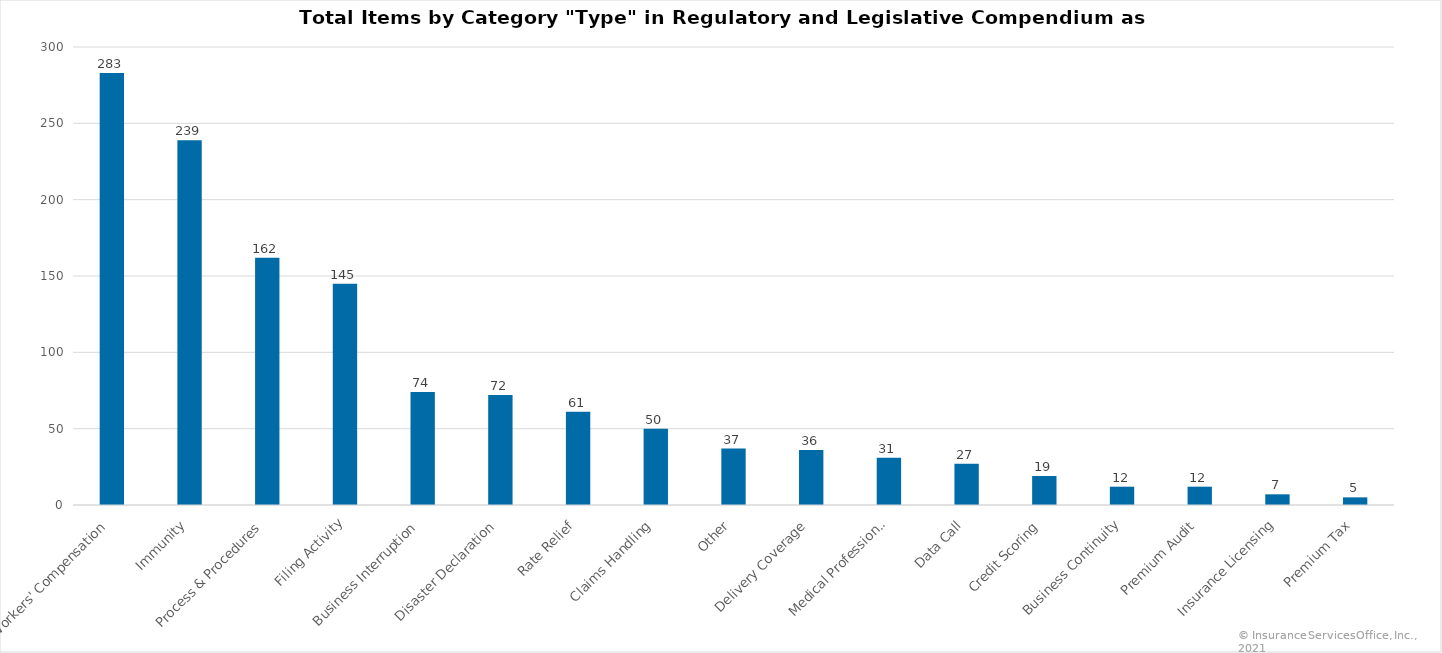
| Category | Count |
|---|---|
| Workers' Compensation | 283 |
| Immunity | 239 |
| Process & Procedures | 162 |
| Filing Activity | 145 |
| Business Interruption | 74 |
| Disaster Declaration | 72 |
| Rate Relief | 61 |
| Claims Handling | 50 |
| Other | 37 |
| Delivery Coverage | 36 |
| Medical Professional | 31 |
| Data Call | 27 |
| Credit Scoring | 19 |
| Business Continuity | 12 |
| Premium Audit | 12 |
| Insurance Licensing | 7 |
| Premium Tax | 5 |